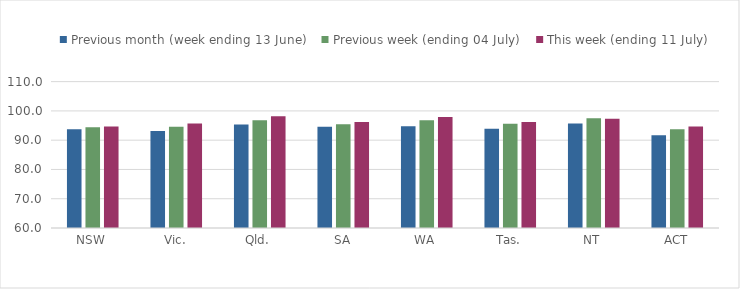
| Category | Previous month (week ending 13 June) | Previous week (ending 04 July) | This week (ending 11 July) |
|---|---|---|---|
| NSW | 93.769 | 94.407 | 94.697 |
| Vic. | 93.111 | 94.604 | 95.693 |
| Qld. | 95.374 | 96.84 | 98.194 |
| SA | 94.621 | 95.431 | 96.248 |
| WA | 94.757 | 96.814 | 97.911 |
| Tas. | 93.938 | 95.641 | 96.214 |
| NT | 95.683 | 97.458 | 97.283 |
| ACT | 91.651 | 93.738 | 94.631 |